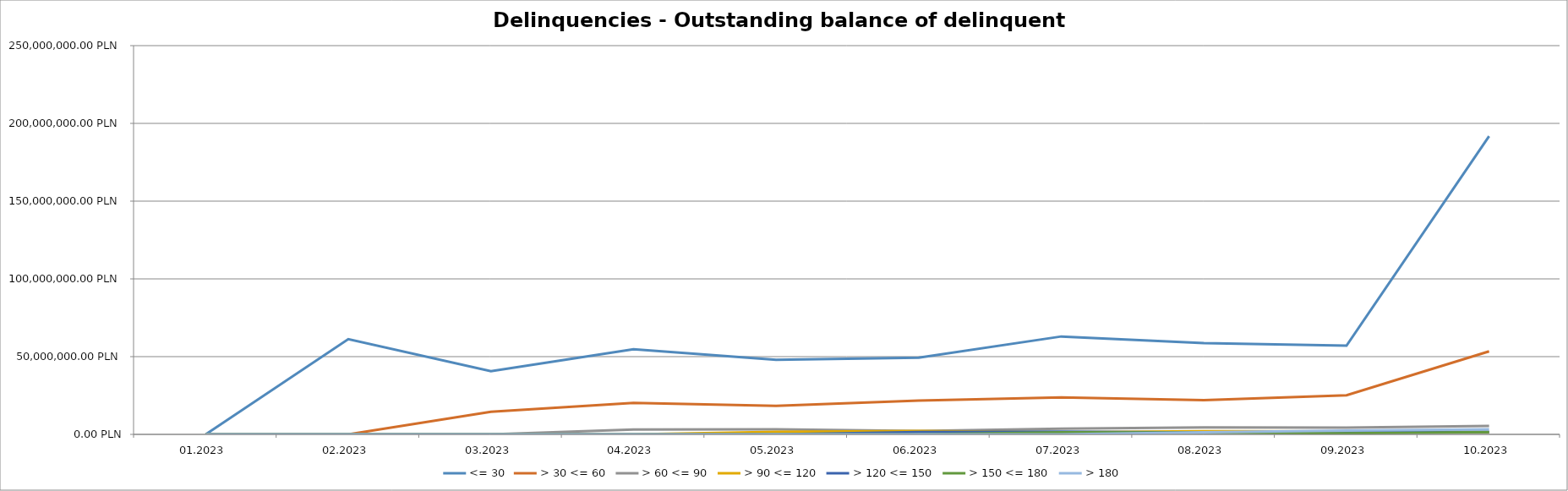
| Category | <= 30 | > 30 <= 60 | > 60 <= 90 | > 90 <= 120 | > 120 <= 150 | > 150 <= 180 | > 180 |
|---|---|---|---|---|---|---|---|
| 01.2023 | 0 | 0 | 0 | 0 | 0 | 0 | 0 |
| 02.2023 | 61279332.52 | 0 | 0 | 0 | 0 | 0 | 0 |
| 03.2023 | 40663789.15 | 14592814.21 | 0 | 0 | 0 | 0 | 0 |
| 04.2023 | 54729258.98 | 20207986.71 | 3105470.81 | 0 | 0 | 0 | 0 |
| 05.2023 | 47980491.52 | 18365026.23 | 3236930.39 | 1575049.71 | 0 | 0 | 0 |
| 06.2023 | 49274463.43 | 21757116.33 | 2145346.9 | 2234258.08 | 1546159.58 | 0 | 0 |
| 07.2023 | 62971390.96 | 23765504.45 | 3638339.96 | 1315739.52 | 1741228.92 | 1367122.32 | 0 |
| 08.2023 | 58667444.31 | 21958530.42 | 4534282.61 | 1998402.31 | 1197894.69 | 1186456.03 | 1367122.32 |
| 09.2023 | 57013090.09 | 25164417.49 | 4339269.75 | 1883194.82 | 1723494.5 | 705526.9 | 2508053.04 |
| 10.2023 | 191776280.48 | 53378945.55 | 5393392.38 | 1354505.77 | 1667300.89 | 1446484.43 | 3213579.94 |